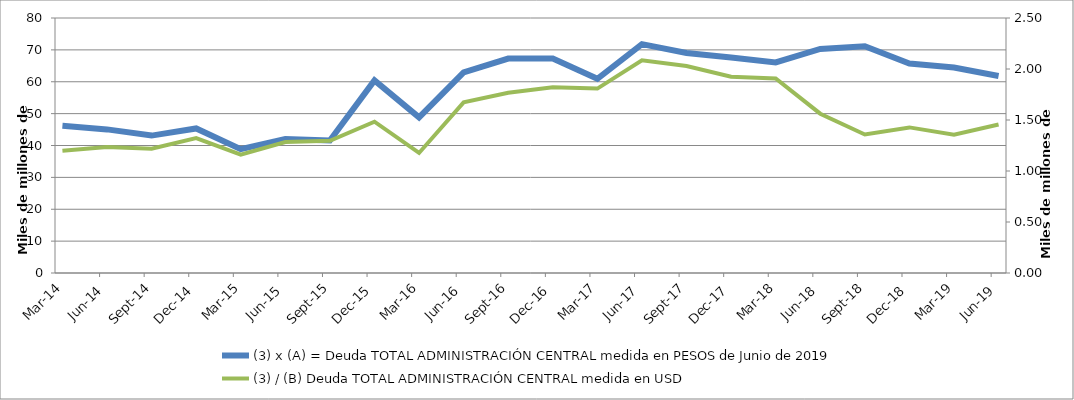
| Category | (3) x (A) = Deuda TOTAL ADMINISTRACIÓN CENTRAL medida en PESOS de Junio de 2019 |
|---|---|
| 2014-03-01 | 46191047629.717 |
| 2014-06-01 | 45050415652.954 |
| 2014-09-01 | 43109614736.057 |
| 2014-12-01 | 45359377391.452 |
| 2015-03-01 | 38837574003.538 |
| 2015-06-01 | 42014236911.922 |
| 2015-09-01 | 41561110956.879 |
| 2015-12-01 | 60423016012.025 |
| 2016-03-01 | 48821464241.786 |
| 2016-06-01 | 62968333495.212 |
| 2016-09-01 | 67287684828.804 |
| 2016-12-01 | 67304994509.365 |
| 2017-03-01 | 60937952786.606 |
| 2017-06-01 | 71786824602.081 |
| 2017-09-01 | 69048272052.982 |
| 2017-12-01 | 67595664724.289 |
| 2018-03-01 | 66059144114.1 |
| 2018-06-01 | 70286689986.284 |
| 2018-09-01 | 71159952723.343 |
| 2018-12-01 | 65708886604.257 |
| 2019-03-01 | 64488480430.611 |
| 2019-06-01 | 61807524405.071 |